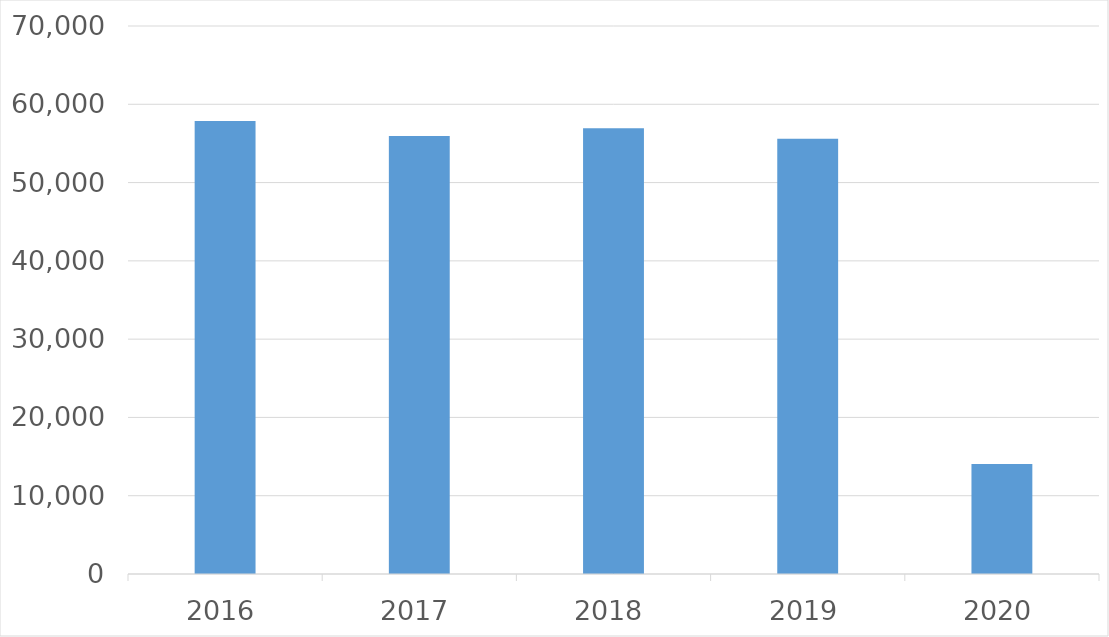
| Category | Series 0 |
|---|---|
| 2016 | 57858 |
| 2017 | 55964 |
| 2018 | 56943 |
| 2019 | 55597 |
| 2020 | 14045 |